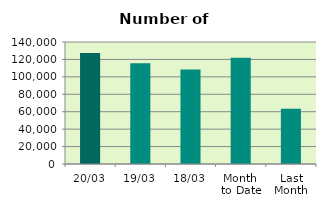
| Category | Series 0 |
|---|---|
| 20/03 | 127350 |
| 19/03 | 115490 |
| 18/03 | 108390 |
| Month 
to Date | 121994.533 |
| Last
Month | 63353.4 |